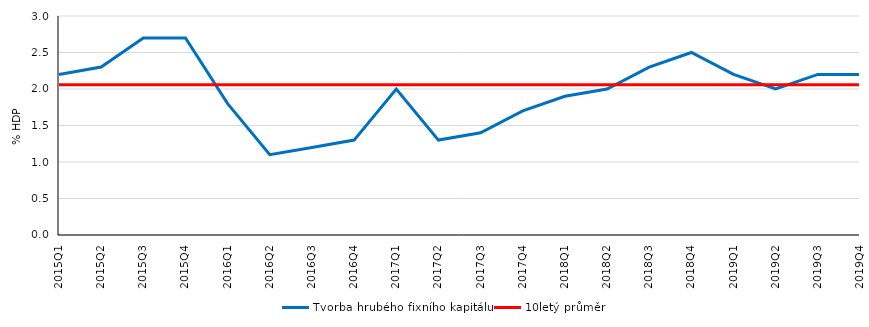
| Category | Tvorba hrubého fixního kapitálu | 10letý průměr |
|---|---|---|
| 2015Q1 | 2.2 | 2.058 |
| 2015Q2 | 2.3 | 2.058 |
| 2015Q3 | 2.7 | 2.058 |
| 2015Q4 | 2.7 | 2.058 |
| 2016Q1 | 1.8 | 2.058 |
| 2016Q2 | 1.1 | 2.058 |
| 2016Q3 | 1.2 | 2.058 |
| 2016Q4 | 1.3 | 2.058 |
| 2017Q1 | 2 | 2.058 |
| 2017Q2 | 1.3 | 2.058 |
| 2017Q3 | 1.4 | 2.058 |
| 2017Q4 | 1.7 | 2.058 |
| 2018Q1 | 1.9 | 2.058 |
| 2018Q2 | 2 | 2.058 |
| 2018Q3 | 2.3 | 2.058 |
| 2018Q4 | 2.5 | 2.058 |
| 2019Q1 | 2.2 | 2.058 |
| 2019Q2 | 2 | 2.058 |
| 2019Q3 | 2.2 | 2.058 |
| 2019Q4 | 2.2 | 2.058 |